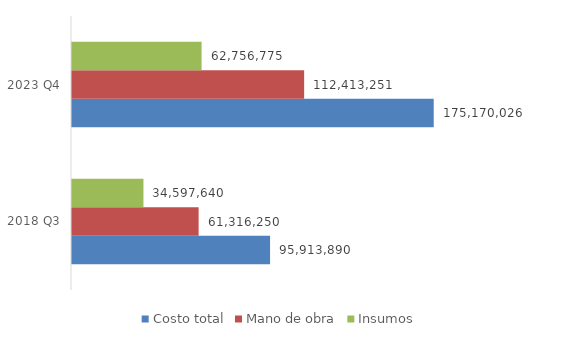
| Category | Costo total | Mano de obra | Insumos |
|---|---|---|---|
| 2018 Q3 | 95913890 | 61316250 | 34597640 |
| 2023 Q4 | 175170026.465 | 112413251 | 62756775.465 |